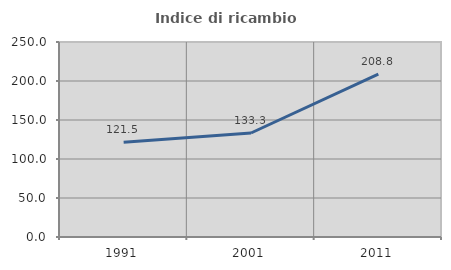
| Category | Indice di ricambio occupazionale  |
|---|---|
| 1991.0 | 121.469 |
| 2001.0 | 133.333 |
| 2011.0 | 208.8 |